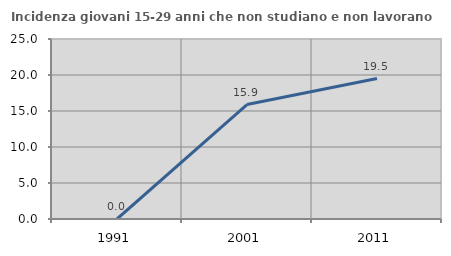
| Category | Incidenza giovani 15-29 anni che non studiano e non lavorano  |
|---|---|
| 1991.0 | 0 |
| 2001.0 | 15.901 |
| 2011.0 | 19.51 |